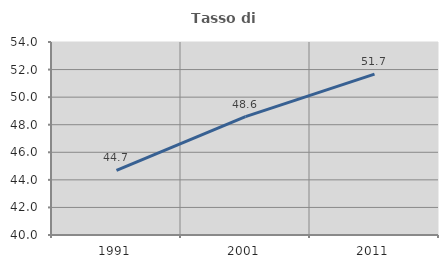
| Category | Tasso di occupazione   |
|---|---|
| 1991.0 | 44.691 |
| 2001.0 | 48.586 |
| 2011.0 | 51.666 |